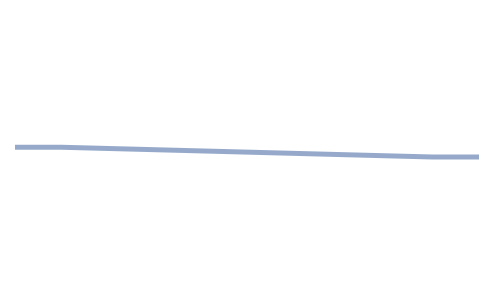
| Category | Series 0 | Series 1 | Series 2 |
|---|---|---|---|
| 0.0 | 3950 | 150 | 4000 |
| 10.0 | 3950 | 150 | 4000 |
| 90.0 | 4250 | 150 | 3700 |
| 100.0 | 4250 | 150 | 3700 |